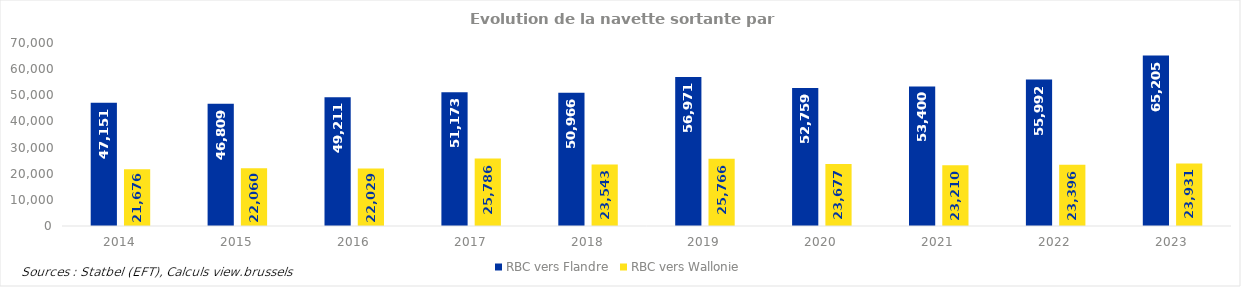
| Category | RBC vers Flandre | RBC vers Wallonie |
|---|---|---|
| 2014.0 | 47151.327 | 21675.824 |
| 2015.0 | 46808.725 | 22060.214 |
| 2016.0 | 49210.626 | 22028.793 |
| 2017.0 | 51172.935 | 25785.545 |
| 2018.0 | 50966.275 | 23542.664 |
| 2019.0 | 56970.827 | 25766.295 |
| 2020.0 | 52758.674 | 23676.648 |
| 2021.0 | 53400.419 | 23209.834 |
| 2022.0 | 55992.26 | 23395.936 |
| 2023.0 | 65204.649 | 23931.181 |